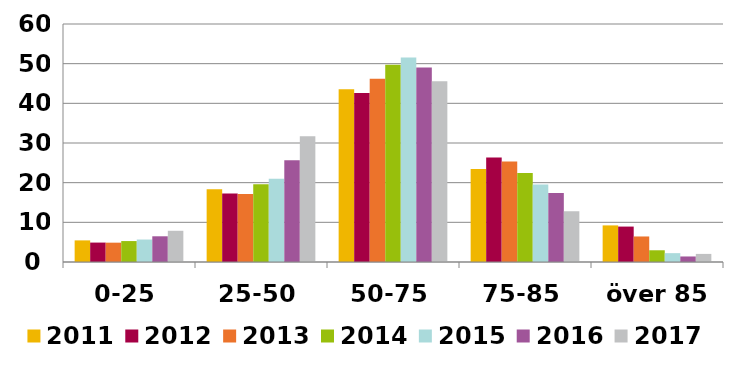
| Category | 2011 | 2012 | 2013 | 2014 | 2015 | 2016 | 2017 |
|---|---|---|---|---|---|---|---|
| 0-25 | 5.448 | 4.896 | 4.874 | 5.278 | 5.666 | 6.483 | 7.869 |
| 25-50 | 18.361 | 17.256 | 17.128 | 19.62 | 20.985 | 25.645 | 31.72 |
| 50-75 | 43.534 | 42.599 | 46.226 | 49.74 | 51.577 | 49.064 | 45.575 |
| 75-85 | 23.429 | 26.319 | 25.336 | 22.406 | 19.541 | 17.413 | 12.795 |
| över 85 | 9.227 | 8.931 | 6.436 | 2.957 | 2.231 | 1.395 | 2.041 |